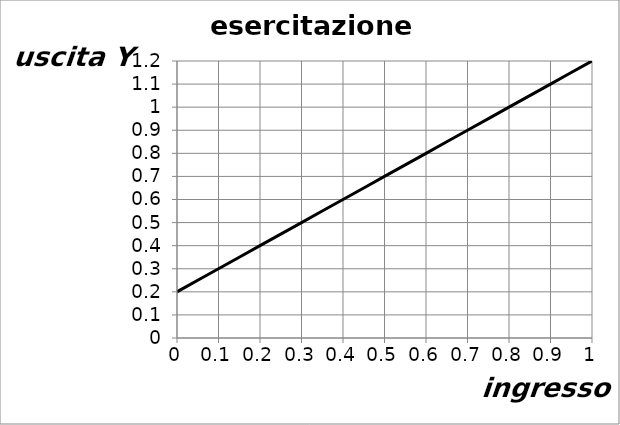
| Category | Series 0 |
|---|---|
| 0.0 | 0.2 |
| 0.1 | 0.3 |
| 0.2 | 0.4 |
| 0.30000000000000004 | 0.5 |
| 0.4 | 0.6 |
| 0.5 | 0.7 |
| 0.6 | 0.8 |
| 0.7 | 0.9 |
| 0.7999999999999999 | 1 |
| 0.8999999999999999 | 1.1 |
| 0.9999999999999999 | 1.2 |